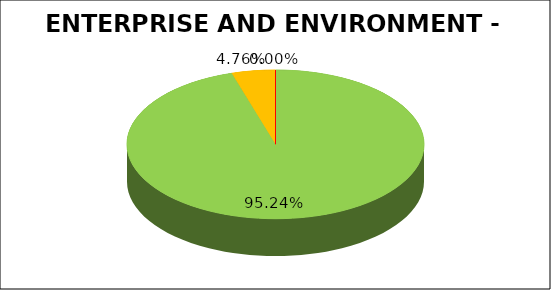
| Category | Series 0 |
|---|---|
| Green | 0.952 |
| Amber | 0.048 |
| Red | 0 |